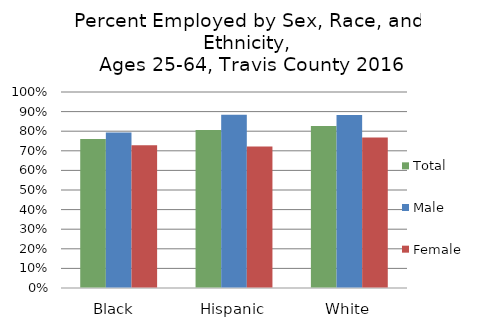
| Category | Total  | Male  | Female |
|---|---|---|---|
| Black  | 0.76 | 0.794 | 0.728 |
| Hispanic | 0.806 | 0.884 | 0.722 |
| White | 0.827 | 0.883 | 0.768 |